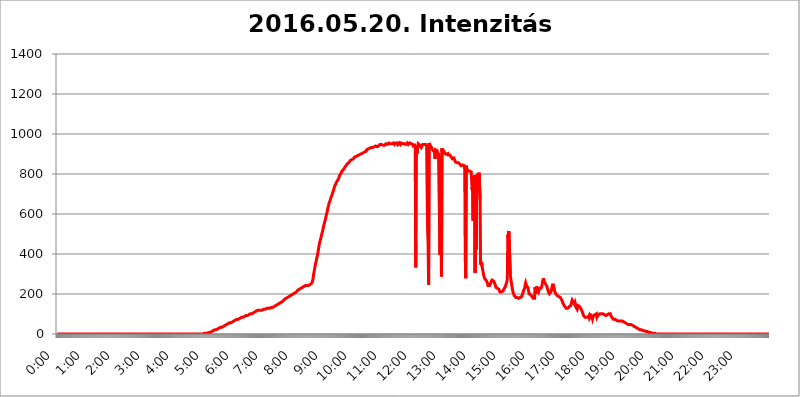
| Category | 2016.05.20. Intenzitás [W/m^2] |
|---|---|
| 0.0 | 0 |
| 0.0006944444444444445 | 0 |
| 0.001388888888888889 | 0 |
| 0.0020833333333333333 | 0 |
| 0.002777777777777778 | 0 |
| 0.003472222222222222 | 0 |
| 0.004166666666666667 | 0 |
| 0.004861111111111111 | 0 |
| 0.005555555555555556 | 0 |
| 0.0062499999999999995 | 0 |
| 0.006944444444444444 | 0 |
| 0.007638888888888889 | 0 |
| 0.008333333333333333 | 0 |
| 0.009027777777777779 | 0 |
| 0.009722222222222222 | 0 |
| 0.010416666666666666 | 0 |
| 0.011111111111111112 | 0 |
| 0.011805555555555555 | 0 |
| 0.012499999999999999 | 0 |
| 0.013194444444444444 | 0 |
| 0.013888888888888888 | 0 |
| 0.014583333333333332 | 0 |
| 0.015277777777777777 | 0 |
| 0.015972222222222224 | 0 |
| 0.016666666666666666 | 0 |
| 0.017361111111111112 | 0 |
| 0.018055555555555557 | 0 |
| 0.01875 | 0 |
| 0.019444444444444445 | 0 |
| 0.02013888888888889 | 0 |
| 0.020833333333333332 | 0 |
| 0.02152777777777778 | 0 |
| 0.022222222222222223 | 0 |
| 0.02291666666666667 | 0 |
| 0.02361111111111111 | 0 |
| 0.024305555555555556 | 0 |
| 0.024999999999999998 | 0 |
| 0.025694444444444447 | 0 |
| 0.02638888888888889 | 0 |
| 0.027083333333333334 | 0 |
| 0.027777777777777776 | 0 |
| 0.02847222222222222 | 0 |
| 0.029166666666666664 | 0 |
| 0.029861111111111113 | 0 |
| 0.030555555555555555 | 0 |
| 0.03125 | 0 |
| 0.03194444444444445 | 0 |
| 0.03263888888888889 | 0 |
| 0.03333333333333333 | 0 |
| 0.034027777777777775 | 0 |
| 0.034722222222222224 | 0 |
| 0.035416666666666666 | 0 |
| 0.036111111111111115 | 0 |
| 0.03680555555555556 | 0 |
| 0.0375 | 0 |
| 0.03819444444444444 | 0 |
| 0.03888888888888889 | 0 |
| 0.03958333333333333 | 0 |
| 0.04027777777777778 | 0 |
| 0.04097222222222222 | 0 |
| 0.041666666666666664 | 0 |
| 0.042361111111111106 | 0 |
| 0.04305555555555556 | 0 |
| 0.043750000000000004 | 0 |
| 0.044444444444444446 | 0 |
| 0.04513888888888889 | 0 |
| 0.04583333333333334 | 0 |
| 0.04652777777777778 | 0 |
| 0.04722222222222222 | 0 |
| 0.04791666666666666 | 0 |
| 0.04861111111111111 | 0 |
| 0.049305555555555554 | 0 |
| 0.049999999999999996 | 0 |
| 0.05069444444444445 | 0 |
| 0.051388888888888894 | 0 |
| 0.052083333333333336 | 0 |
| 0.05277777777777778 | 0 |
| 0.05347222222222222 | 0 |
| 0.05416666666666667 | 0 |
| 0.05486111111111111 | 0 |
| 0.05555555555555555 | 0 |
| 0.05625 | 0 |
| 0.05694444444444444 | 0 |
| 0.057638888888888885 | 0 |
| 0.05833333333333333 | 0 |
| 0.05902777777777778 | 0 |
| 0.059722222222222225 | 0 |
| 0.06041666666666667 | 0 |
| 0.061111111111111116 | 0 |
| 0.06180555555555556 | 0 |
| 0.0625 | 0 |
| 0.06319444444444444 | 0 |
| 0.06388888888888888 | 0 |
| 0.06458333333333334 | 0 |
| 0.06527777777777778 | 0 |
| 0.06597222222222222 | 0 |
| 0.06666666666666667 | 0 |
| 0.06736111111111111 | 0 |
| 0.06805555555555555 | 0 |
| 0.06874999999999999 | 0 |
| 0.06944444444444443 | 0 |
| 0.07013888888888889 | 0 |
| 0.07083333333333333 | 0 |
| 0.07152777777777779 | 0 |
| 0.07222222222222223 | 0 |
| 0.07291666666666667 | 0 |
| 0.07361111111111111 | 0 |
| 0.07430555555555556 | 0 |
| 0.075 | 0 |
| 0.07569444444444444 | 0 |
| 0.0763888888888889 | 0 |
| 0.07708333333333334 | 0 |
| 0.07777777777777778 | 0 |
| 0.07847222222222222 | 0 |
| 0.07916666666666666 | 0 |
| 0.0798611111111111 | 0 |
| 0.08055555555555556 | 0 |
| 0.08125 | 0 |
| 0.08194444444444444 | 0 |
| 0.08263888888888889 | 0 |
| 0.08333333333333333 | 0 |
| 0.08402777777777777 | 0 |
| 0.08472222222222221 | 0 |
| 0.08541666666666665 | 0 |
| 0.08611111111111112 | 0 |
| 0.08680555555555557 | 0 |
| 0.08750000000000001 | 0 |
| 0.08819444444444445 | 0 |
| 0.08888888888888889 | 0 |
| 0.08958333333333333 | 0 |
| 0.09027777777777778 | 0 |
| 0.09097222222222222 | 0 |
| 0.09166666666666667 | 0 |
| 0.09236111111111112 | 0 |
| 0.09305555555555556 | 0 |
| 0.09375 | 0 |
| 0.09444444444444444 | 0 |
| 0.09513888888888888 | 0 |
| 0.09583333333333333 | 0 |
| 0.09652777777777777 | 0 |
| 0.09722222222222222 | 0 |
| 0.09791666666666667 | 0 |
| 0.09861111111111111 | 0 |
| 0.09930555555555555 | 0 |
| 0.09999999999999999 | 0 |
| 0.10069444444444443 | 0 |
| 0.1013888888888889 | 0 |
| 0.10208333333333335 | 0 |
| 0.10277777777777779 | 0 |
| 0.10347222222222223 | 0 |
| 0.10416666666666667 | 0 |
| 0.10486111111111111 | 0 |
| 0.10555555555555556 | 0 |
| 0.10625 | 0 |
| 0.10694444444444444 | 0 |
| 0.1076388888888889 | 0 |
| 0.10833333333333334 | 0 |
| 0.10902777777777778 | 0 |
| 0.10972222222222222 | 0 |
| 0.1111111111111111 | 0 |
| 0.11180555555555556 | 0 |
| 0.11180555555555556 | 0 |
| 0.1125 | 0 |
| 0.11319444444444444 | 0 |
| 0.11388888888888889 | 0 |
| 0.11458333333333333 | 0 |
| 0.11527777777777777 | 0 |
| 0.11597222222222221 | 0 |
| 0.11666666666666665 | 0 |
| 0.1173611111111111 | 0 |
| 0.11805555555555557 | 0 |
| 0.11944444444444445 | 0 |
| 0.12013888888888889 | 0 |
| 0.12083333333333333 | 0 |
| 0.12152777777777778 | 0 |
| 0.12222222222222223 | 0 |
| 0.12291666666666667 | 0 |
| 0.12291666666666667 | 0 |
| 0.12361111111111112 | 0 |
| 0.12430555555555556 | 0 |
| 0.125 | 0 |
| 0.12569444444444444 | 0 |
| 0.12638888888888888 | 0 |
| 0.12708333333333333 | 0 |
| 0.16875 | 0 |
| 0.12847222222222224 | 0 |
| 0.12916666666666668 | 0 |
| 0.12986111111111112 | 0 |
| 0.13055555555555556 | 0 |
| 0.13125 | 0 |
| 0.13194444444444445 | 0 |
| 0.1326388888888889 | 0 |
| 0.13333333333333333 | 0 |
| 0.13402777777777777 | 0 |
| 0.13402777777777777 | 0 |
| 0.13472222222222222 | 0 |
| 0.13541666666666666 | 0 |
| 0.1361111111111111 | 0 |
| 0.13749999999999998 | 0 |
| 0.13819444444444443 | 0 |
| 0.1388888888888889 | 0 |
| 0.13958333333333334 | 0 |
| 0.14027777777777778 | 0 |
| 0.14097222222222222 | 0 |
| 0.14166666666666666 | 0 |
| 0.1423611111111111 | 0 |
| 0.14305555555555557 | 0 |
| 0.14375000000000002 | 0 |
| 0.14444444444444446 | 0 |
| 0.1451388888888889 | 0 |
| 0.1451388888888889 | 0 |
| 0.14652777777777778 | 0 |
| 0.14722222222222223 | 0 |
| 0.14791666666666667 | 0 |
| 0.1486111111111111 | 0 |
| 0.14930555555555555 | 0 |
| 0.15 | 0 |
| 0.15069444444444444 | 0 |
| 0.15138888888888888 | 0 |
| 0.15208333333333332 | 0 |
| 0.15277777777777776 | 0 |
| 0.15347222222222223 | 0 |
| 0.15416666666666667 | 0 |
| 0.15486111111111112 | 0 |
| 0.15555555555555556 | 0 |
| 0.15625 | 0 |
| 0.15694444444444444 | 0 |
| 0.15763888888888888 | 0 |
| 0.15833333333333333 | 0 |
| 0.15902777777777777 | 0 |
| 0.15972222222222224 | 0 |
| 0.16041666666666668 | 0 |
| 0.16111111111111112 | 0 |
| 0.16180555555555556 | 0 |
| 0.1625 | 0 |
| 0.16319444444444445 | 0 |
| 0.1638888888888889 | 0 |
| 0.16458333333333333 | 0 |
| 0.16527777777777777 | 0 |
| 0.16597222222222222 | 0 |
| 0.16666666666666666 | 0 |
| 0.1673611111111111 | 0 |
| 0.16805555555555554 | 0 |
| 0.16874999999999998 | 0 |
| 0.16944444444444443 | 0 |
| 0.17013888888888887 | 0 |
| 0.1708333333333333 | 0 |
| 0.17152777777777775 | 0 |
| 0.17222222222222225 | 0 |
| 0.1729166666666667 | 0 |
| 0.17361111111111113 | 0 |
| 0.17430555555555557 | 0 |
| 0.17500000000000002 | 0 |
| 0.17569444444444446 | 0 |
| 0.1763888888888889 | 0 |
| 0.17708333333333334 | 0 |
| 0.17777777777777778 | 0 |
| 0.17847222222222223 | 0 |
| 0.17916666666666667 | 0 |
| 0.1798611111111111 | 0 |
| 0.18055555555555555 | 0 |
| 0.18125 | 0 |
| 0.18194444444444444 | 0 |
| 0.1826388888888889 | 0 |
| 0.18333333333333335 | 0 |
| 0.1840277777777778 | 0 |
| 0.18472222222222223 | 0 |
| 0.18541666666666667 | 0 |
| 0.18611111111111112 | 0 |
| 0.18680555555555556 | 0 |
| 0.1875 | 0 |
| 0.18819444444444444 | 0 |
| 0.18888888888888888 | 0 |
| 0.18958333333333333 | 0 |
| 0.19027777777777777 | 0 |
| 0.1909722222222222 | 0 |
| 0.19166666666666665 | 0 |
| 0.19236111111111112 | 0 |
| 0.19305555555555554 | 0 |
| 0.19375 | 0 |
| 0.19444444444444445 | 0 |
| 0.1951388888888889 | 0 |
| 0.19583333333333333 | 0 |
| 0.19652777777777777 | 0 |
| 0.19722222222222222 | 0 |
| 0.19791666666666666 | 0 |
| 0.1986111111111111 | 0 |
| 0.19930555555555554 | 0 |
| 0.19999999999999998 | 0 |
| 0.20069444444444443 | 0 |
| 0.20138888888888887 | 0 |
| 0.2020833333333333 | 0 |
| 0.2027777777777778 | 0 |
| 0.2034722222222222 | 0 |
| 0.2041666666666667 | 0 |
| 0.20486111111111113 | 0 |
| 0.20555555555555557 | 3.525 |
| 0.20625000000000002 | 3.525 |
| 0.20694444444444446 | 3.525 |
| 0.2076388888888889 | 3.525 |
| 0.20833333333333334 | 3.525 |
| 0.20902777777777778 | 3.525 |
| 0.20972222222222223 | 3.525 |
| 0.21041666666666667 | 3.525 |
| 0.2111111111111111 | 3.525 |
| 0.21180555555555555 | 3.525 |
| 0.2125 | 7.887 |
| 0.21319444444444444 | 7.887 |
| 0.2138888888888889 | 7.887 |
| 0.21458333333333335 | 7.887 |
| 0.2152777777777778 | 7.887 |
| 0.21597222222222223 | 12.257 |
| 0.21666666666666667 | 12.257 |
| 0.21736111111111112 | 12.257 |
| 0.21805555555555556 | 12.257 |
| 0.21875 | 16.636 |
| 0.21944444444444444 | 16.636 |
| 0.22013888888888888 | 16.636 |
| 0.22083333333333333 | 21.024 |
| 0.22152777777777777 | 21.024 |
| 0.2222222222222222 | 21.024 |
| 0.22291666666666665 | 21.024 |
| 0.2236111111111111 | 21.024 |
| 0.22430555555555556 | 25.419 |
| 0.225 | 25.419 |
| 0.22569444444444445 | 25.419 |
| 0.2263888888888889 | 29.823 |
| 0.22708333333333333 | 29.823 |
| 0.22777777777777777 | 29.823 |
| 0.22847222222222222 | 29.823 |
| 0.22916666666666666 | 34.234 |
| 0.2298611111111111 | 34.234 |
| 0.23055555555555554 | 34.234 |
| 0.23124999999999998 | 34.234 |
| 0.23194444444444443 | 38.653 |
| 0.23263888888888887 | 38.653 |
| 0.2333333333333333 | 38.653 |
| 0.2340277777777778 | 38.653 |
| 0.2347222222222222 | 43.079 |
| 0.2354166666666667 | 43.079 |
| 0.23611111111111113 | 43.079 |
| 0.23680555555555557 | 47.511 |
| 0.23750000000000002 | 47.511 |
| 0.23819444444444446 | 47.511 |
| 0.2388888888888889 | 47.511 |
| 0.23958333333333334 | 51.951 |
| 0.24027777777777778 | 51.951 |
| 0.24097222222222223 | 51.951 |
| 0.24166666666666667 | 56.398 |
| 0.2423611111111111 | 56.398 |
| 0.24305555555555555 | 56.398 |
| 0.24375 | 56.398 |
| 0.24444444444444446 | 60.85 |
| 0.24513888888888888 | 60.85 |
| 0.24583333333333335 | 60.85 |
| 0.2465277777777778 | 65.31 |
| 0.24722222222222223 | 65.31 |
| 0.24791666666666667 | 65.31 |
| 0.24861111111111112 | 65.31 |
| 0.24930555555555556 | 65.31 |
| 0.25 | 69.775 |
| 0.25069444444444444 | 69.775 |
| 0.2513888888888889 | 74.246 |
| 0.2520833333333333 | 74.246 |
| 0.25277777777777777 | 74.246 |
| 0.2534722222222222 | 74.246 |
| 0.25416666666666665 | 74.246 |
| 0.2548611111111111 | 78.722 |
| 0.2555555555555556 | 78.722 |
| 0.25625000000000003 | 78.722 |
| 0.2569444444444445 | 78.722 |
| 0.2576388888888889 | 83.205 |
| 0.25833333333333336 | 83.205 |
| 0.2590277777777778 | 83.205 |
| 0.25972222222222224 | 83.205 |
| 0.2604166666666667 | 83.205 |
| 0.2611111111111111 | 83.205 |
| 0.26180555555555557 | 87.692 |
| 0.2625 | 87.692 |
| 0.26319444444444445 | 87.692 |
| 0.2638888888888889 | 92.184 |
| 0.26458333333333334 | 92.184 |
| 0.2652777777777778 | 92.184 |
| 0.2659722222222222 | 92.184 |
| 0.26666666666666666 | 92.184 |
| 0.2673611111111111 | 96.682 |
| 0.26805555555555555 | 96.682 |
| 0.26875 | 96.682 |
| 0.26944444444444443 | 96.682 |
| 0.2701388888888889 | 101.184 |
| 0.2708333333333333 | 101.184 |
| 0.27152777777777776 | 101.184 |
| 0.2722222222222222 | 101.184 |
| 0.27291666666666664 | 101.184 |
| 0.2736111111111111 | 101.184 |
| 0.2743055555555555 | 105.69 |
| 0.27499999999999997 | 105.69 |
| 0.27569444444444446 | 105.69 |
| 0.27638888888888885 | 110.201 |
| 0.27708333333333335 | 110.201 |
| 0.2777777777777778 | 110.201 |
| 0.27847222222222223 | 110.201 |
| 0.2791666666666667 | 114.716 |
| 0.2798611111111111 | 114.716 |
| 0.28055555555555556 | 119.235 |
| 0.28125 | 119.235 |
| 0.28194444444444444 | 119.235 |
| 0.2826388888888889 | 119.235 |
| 0.2833333333333333 | 119.235 |
| 0.28402777777777777 | 119.235 |
| 0.2847222222222222 | 119.235 |
| 0.28541666666666665 | 119.235 |
| 0.28611111111111115 | 119.235 |
| 0.28680555555555554 | 119.235 |
| 0.28750000000000003 | 119.235 |
| 0.2881944444444445 | 119.235 |
| 0.2888888888888889 | 123.758 |
| 0.28958333333333336 | 123.758 |
| 0.2902777777777778 | 123.758 |
| 0.29097222222222224 | 123.758 |
| 0.2916666666666667 | 123.758 |
| 0.2923611111111111 | 123.758 |
| 0.29305555555555557 | 123.758 |
| 0.29375 | 128.284 |
| 0.29444444444444445 | 128.284 |
| 0.2951388888888889 | 128.284 |
| 0.29583333333333334 | 128.284 |
| 0.2965277777777778 | 128.284 |
| 0.2972222222222222 | 128.284 |
| 0.29791666666666666 | 128.284 |
| 0.2986111111111111 | 128.284 |
| 0.29930555555555555 | 132.814 |
| 0.3 | 132.814 |
| 0.30069444444444443 | 132.814 |
| 0.3013888888888889 | 132.814 |
| 0.3020833333333333 | 132.814 |
| 0.30277777777777776 | 137.347 |
| 0.3034722222222222 | 137.347 |
| 0.30416666666666664 | 137.347 |
| 0.3048611111111111 | 137.347 |
| 0.3055555555555555 | 141.884 |
| 0.30624999999999997 | 141.884 |
| 0.3069444444444444 | 146.423 |
| 0.3076388888888889 | 146.423 |
| 0.30833333333333335 | 146.423 |
| 0.3090277777777778 | 150.964 |
| 0.30972222222222223 | 150.964 |
| 0.3104166666666667 | 150.964 |
| 0.3111111111111111 | 155.509 |
| 0.31180555555555556 | 155.509 |
| 0.3125 | 155.509 |
| 0.31319444444444444 | 155.509 |
| 0.3138888888888889 | 160.056 |
| 0.3145833333333333 | 160.056 |
| 0.31527777777777777 | 164.605 |
| 0.3159722222222222 | 164.605 |
| 0.31666666666666665 | 164.605 |
| 0.31736111111111115 | 169.156 |
| 0.31805555555555554 | 169.156 |
| 0.31875000000000003 | 173.709 |
| 0.3194444444444445 | 173.709 |
| 0.3201388888888889 | 173.709 |
| 0.32083333333333336 | 178.264 |
| 0.3215277777777778 | 178.264 |
| 0.32222222222222224 | 182.82 |
| 0.3229166666666667 | 182.82 |
| 0.3236111111111111 | 182.82 |
| 0.32430555555555557 | 182.82 |
| 0.325 | 187.378 |
| 0.32569444444444445 | 187.378 |
| 0.3263888888888889 | 187.378 |
| 0.32708333333333334 | 191.937 |
| 0.3277777777777778 | 191.937 |
| 0.3284722222222222 | 191.937 |
| 0.32916666666666666 | 196.497 |
| 0.3298611111111111 | 196.497 |
| 0.33055555555555555 | 201.058 |
| 0.33125 | 201.058 |
| 0.33194444444444443 | 201.058 |
| 0.3326388888888889 | 205.62 |
| 0.3333333333333333 | 205.62 |
| 0.3340277777777778 | 210.182 |
| 0.3347222222222222 | 210.182 |
| 0.3354166666666667 | 210.182 |
| 0.3361111111111111 | 214.746 |
| 0.3368055555555556 | 214.746 |
| 0.33749999999999997 | 219.309 |
| 0.33819444444444446 | 219.309 |
| 0.33888888888888885 | 219.309 |
| 0.33958333333333335 | 223.873 |
| 0.34027777777777773 | 228.436 |
| 0.34097222222222223 | 228.436 |
| 0.3416666666666666 | 228.436 |
| 0.3423611111111111 | 228.436 |
| 0.3430555555555555 | 228.436 |
| 0.34375 | 233 |
| 0.3444444444444445 | 233 |
| 0.3451388888888889 | 237.564 |
| 0.3458333333333334 | 237.564 |
| 0.34652777777777777 | 237.564 |
| 0.34722222222222227 | 237.564 |
| 0.34791666666666665 | 242.127 |
| 0.34861111111111115 | 242.127 |
| 0.34930555555555554 | 242.127 |
| 0.35000000000000003 | 242.127 |
| 0.3506944444444444 | 242.127 |
| 0.3513888888888889 | 242.127 |
| 0.3520833333333333 | 242.127 |
| 0.3527777777777778 | 242.127 |
| 0.3534722222222222 | 242.127 |
| 0.3541666666666667 | 246.689 |
| 0.3548611111111111 | 251.251 |
| 0.35555555555555557 | 251.251 |
| 0.35625 | 251.251 |
| 0.35694444444444445 | 255.813 |
| 0.3576388888888889 | 260.373 |
| 0.35833333333333334 | 269.49 |
| 0.3590277777777778 | 283.156 |
| 0.3597222222222222 | 301.354 |
| 0.36041666666666666 | 314.98 |
| 0.3611111111111111 | 328.584 |
| 0.36180555555555555 | 342.162 |
| 0.3625 | 355.712 |
| 0.36319444444444443 | 364.728 |
| 0.3638888888888889 | 378.224 |
| 0.3645833333333333 | 387.202 |
| 0.3652777777777778 | 400.638 |
| 0.3659722222222222 | 414.035 |
| 0.3666666666666667 | 431.833 |
| 0.3673611111111111 | 445.129 |
| 0.3680555555555556 | 458.38 |
| 0.36874999999999997 | 462.786 |
| 0.36944444444444446 | 475.972 |
| 0.37013888888888885 | 484.735 |
| 0.37083333333333335 | 497.836 |
| 0.37152777777777773 | 506.542 |
| 0.37222222222222223 | 515.223 |
| 0.3729166666666666 | 528.2 |
| 0.3736111111111111 | 532.513 |
| 0.3743055555555555 | 549.704 |
| 0.375 | 558.261 |
| 0.3756944444444445 | 566.793 |
| 0.3763888888888889 | 579.542 |
| 0.3770833333333334 | 588.009 |
| 0.37777777777777777 | 600.661 |
| 0.37847222222222227 | 609.062 |
| 0.37916666666666665 | 621.613 |
| 0.37986111111111115 | 634.105 |
| 0.38055555555555554 | 642.4 |
| 0.38125000000000003 | 654.791 |
| 0.3819444444444444 | 658.909 |
| 0.3826388888888889 | 667.123 |
| 0.3833333333333333 | 671.22 |
| 0.3840277777777778 | 683.473 |
| 0.3847222222222222 | 687.544 |
| 0.3854166666666667 | 695.666 |
| 0.3861111111111111 | 703.762 |
| 0.38680555555555557 | 711.832 |
| 0.3875 | 719.877 |
| 0.38819444444444445 | 727.896 |
| 0.3888888888888889 | 731.896 |
| 0.38958333333333334 | 743.859 |
| 0.3902777777777778 | 747.834 |
| 0.3909722222222222 | 751.803 |
| 0.39166666666666666 | 759.723 |
| 0.3923611111111111 | 759.723 |
| 0.39305555555555555 | 767.62 |
| 0.39375 | 771.559 |
| 0.39444444444444443 | 775.492 |
| 0.3951388888888889 | 783.342 |
| 0.3958333333333333 | 791.169 |
| 0.3965277777777778 | 795.074 |
| 0.3972222222222222 | 798.974 |
| 0.3979166666666667 | 802.868 |
| 0.3986111111111111 | 806.757 |
| 0.3993055555555556 | 814.519 |
| 0.39999999999999997 | 814.519 |
| 0.40069444444444446 | 818.392 |
| 0.40138888888888885 | 822.26 |
| 0.40208333333333335 | 826.123 |
| 0.40277777777777773 | 829.981 |
| 0.40347222222222223 | 833.834 |
| 0.4041666666666666 | 837.682 |
| 0.4048611111111111 | 841.526 |
| 0.4055555555555555 | 845.365 |
| 0.40625 | 845.365 |
| 0.4069444444444445 | 849.199 |
| 0.4076388888888889 | 853.029 |
| 0.4083333333333334 | 853.029 |
| 0.40902777777777777 | 856.855 |
| 0.40972222222222227 | 860.676 |
| 0.41041666666666665 | 864.493 |
| 0.41111111111111115 | 868.305 |
| 0.41180555555555554 | 868.305 |
| 0.41250000000000003 | 868.305 |
| 0.4131944444444444 | 872.114 |
| 0.4138888888888889 | 875.918 |
| 0.4145833333333333 | 875.918 |
| 0.4152777777777778 | 875.918 |
| 0.4159722222222222 | 879.719 |
| 0.4166666666666667 | 883.516 |
| 0.4173611111111111 | 883.516 |
| 0.41805555555555557 | 887.309 |
| 0.41875 | 887.309 |
| 0.41944444444444445 | 887.309 |
| 0.4201388888888889 | 891.099 |
| 0.42083333333333334 | 891.099 |
| 0.4215277777777778 | 891.099 |
| 0.4222222222222222 | 894.885 |
| 0.42291666666666666 | 894.885 |
| 0.4236111111111111 | 894.885 |
| 0.42430555555555555 | 894.885 |
| 0.425 | 898.668 |
| 0.42569444444444443 | 898.668 |
| 0.4263888888888889 | 902.447 |
| 0.4270833333333333 | 902.447 |
| 0.4277777777777778 | 902.447 |
| 0.4284722222222222 | 906.223 |
| 0.4291666666666667 | 906.223 |
| 0.4298611111111111 | 906.223 |
| 0.4305555555555556 | 906.223 |
| 0.43124999999999997 | 909.996 |
| 0.43194444444444446 | 909.996 |
| 0.43263888888888885 | 909.996 |
| 0.43333333333333335 | 913.766 |
| 0.43402777777777773 | 921.298 |
| 0.43472222222222223 | 917.534 |
| 0.4354166666666666 | 921.298 |
| 0.4361111111111111 | 925.06 |
| 0.4368055555555555 | 928.819 |
| 0.4375 | 928.819 |
| 0.4381944444444445 | 928.819 |
| 0.4388888888888889 | 932.576 |
| 0.4395833333333334 | 932.576 |
| 0.44027777777777777 | 932.576 |
| 0.44097222222222227 | 932.576 |
| 0.44166666666666665 | 932.576 |
| 0.44236111111111115 | 932.576 |
| 0.44305555555555554 | 932.576 |
| 0.44375000000000003 | 936.33 |
| 0.4444444444444444 | 936.33 |
| 0.4451388888888889 | 936.33 |
| 0.4458333333333333 | 936.33 |
| 0.4465277777777778 | 940.082 |
| 0.4472222222222222 | 940.082 |
| 0.4479166666666667 | 936.33 |
| 0.4486111111111111 | 936.33 |
| 0.44930555555555557 | 936.33 |
| 0.45 | 940.082 |
| 0.45069444444444445 | 940.082 |
| 0.4513888888888889 | 943.832 |
| 0.45208333333333334 | 943.832 |
| 0.4527777777777778 | 947.58 |
| 0.4534722222222222 | 947.58 |
| 0.45416666666666666 | 947.58 |
| 0.4548611111111111 | 947.58 |
| 0.45555555555555555 | 943.832 |
| 0.45625 | 943.832 |
| 0.45694444444444443 | 943.832 |
| 0.4576388888888889 | 943.832 |
| 0.4583333333333333 | 940.082 |
| 0.4590277777777778 | 943.832 |
| 0.4597222222222222 | 943.832 |
| 0.4604166666666667 | 943.832 |
| 0.4611111111111111 | 951.327 |
| 0.4618055555555556 | 951.327 |
| 0.46249999999999997 | 947.58 |
| 0.46319444444444446 | 947.58 |
| 0.46388888888888885 | 951.327 |
| 0.46458333333333335 | 951.327 |
| 0.46527777777777773 | 955.071 |
| 0.46597222222222223 | 951.327 |
| 0.4666666666666666 | 951.327 |
| 0.4673611111111111 | 951.327 |
| 0.4680555555555555 | 947.58 |
| 0.46875 | 947.58 |
| 0.4694444444444445 | 951.327 |
| 0.4701388888888889 | 951.327 |
| 0.4708333333333334 | 955.071 |
| 0.47152777777777777 | 955.071 |
| 0.47222222222222227 | 955.071 |
| 0.47291666666666665 | 947.58 |
| 0.47361111111111115 | 951.327 |
| 0.47430555555555554 | 943.832 |
| 0.47500000000000003 | 955.071 |
| 0.4756944444444444 | 951.327 |
| 0.4763888888888889 | 951.327 |
| 0.4770833333333333 | 955.071 |
| 0.4777777777777778 | 947.58 |
| 0.4784722222222222 | 951.327 |
| 0.4791666666666667 | 951.327 |
| 0.4798611111111111 | 955.071 |
| 0.48055555555555557 | 951.327 |
| 0.48125 | 947.58 |
| 0.48194444444444445 | 947.58 |
| 0.4826388888888889 | 955.071 |
| 0.48333333333333334 | 958.814 |
| 0.4840277777777778 | 955.071 |
| 0.4847222222222222 | 951.327 |
| 0.48541666666666666 | 951.327 |
| 0.4861111111111111 | 951.327 |
| 0.48680555555555555 | 951.327 |
| 0.4875 | 947.58 |
| 0.48819444444444443 | 947.58 |
| 0.4888888888888889 | 947.58 |
| 0.4895833333333333 | 947.58 |
| 0.4902777777777778 | 947.58 |
| 0.4909722222222222 | 955.071 |
| 0.4916666666666667 | 951.327 |
| 0.4923611111111111 | 947.58 |
| 0.4930555555555556 | 951.327 |
| 0.49374999999999997 | 951.327 |
| 0.49444444444444446 | 955.071 |
| 0.49513888888888885 | 955.071 |
| 0.49583333333333335 | 955.071 |
| 0.49652777777777773 | 951.327 |
| 0.49722222222222223 | 951.327 |
| 0.4979166666666666 | 955.071 |
| 0.4986111111111111 | 947.58 |
| 0.4993055555555555 | 940.082 |
| 0.5 | 940.082 |
| 0.5006944444444444 | 940.082 |
| 0.5013888888888889 | 943.832 |
| 0.5020833333333333 | 936.33 |
| 0.5027777777777778 | 333.113 |
| 0.5034722222222222 | 940.082 |
| 0.5041666666666667 | 936.33 |
| 0.5048611111111111 | 902.447 |
| 0.5055555555555555 | 940.082 |
| 0.50625 | 951.327 |
| 0.5069444444444444 | 947.58 |
| 0.5076388888888889 | 951.327 |
| 0.5083333333333333 | 943.832 |
| 0.5090277777777777 | 943.832 |
| 0.5097222222222222 | 940.082 |
| 0.5104166666666666 | 932.576 |
| 0.5111111111111112 | 932.576 |
| 0.5118055555555555 | 936.33 |
| 0.5125000000000001 | 947.58 |
| 0.5131944444444444 | 947.58 |
| 0.513888888888889 | 943.832 |
| 0.5145833333333333 | 947.58 |
| 0.5152777777777778 | 947.58 |
| 0.5159722222222222 | 947.58 |
| 0.5166666666666667 | 947.58 |
| 0.517361111111111 | 943.832 |
| 0.5180555555555556 | 940.082 |
| 0.5187499999999999 | 936.33 |
| 0.5194444444444445 | 519.555 |
| 0.5201388888888888 | 453.968 |
| 0.5208333333333334 | 246.689 |
| 0.5215277777777778 | 955.071 |
| 0.5222222222222223 | 947.58 |
| 0.5229166666666667 | 943.832 |
| 0.5236111111111111 | 947.58 |
| 0.5243055555555556 | 936.33 |
| 0.525 | 940.082 |
| 0.5256944444444445 | 925.06 |
| 0.5263888888888889 | 925.06 |
| 0.5270833333333333 | 917.534 |
| 0.5277777777777778 | 921.298 |
| 0.5284722222222222 | 917.534 |
| 0.5291666666666667 | 909.996 |
| 0.5298611111111111 | 875.918 |
| 0.5305555555555556 | 921.298 |
| 0.53125 | 917.534 |
| 0.5319444444444444 | 917.534 |
| 0.5326388888888889 | 917.534 |
| 0.5333333333333333 | 921.298 |
| 0.5340277777777778 | 917.534 |
| 0.5347222222222222 | 898.668 |
| 0.5354166666666667 | 902.447 |
| 0.5361111111111111 | 902.447 |
| 0.5368055555555555 | 396.164 |
| 0.5375 | 891.099 |
| 0.5381944444444444 | 545.416 |
| 0.5388888888888889 | 287.709 |
| 0.5395833333333333 | 928.819 |
| 0.5402777777777777 | 909.996 |
| 0.5409722222222222 | 906.223 |
| 0.5416666666666666 | 913.766 |
| 0.5423611111111112 | 913.766 |
| 0.5430555555555555 | 909.996 |
| 0.5437500000000001 | 902.447 |
| 0.5444444444444444 | 902.447 |
| 0.545138888888889 | 898.668 |
| 0.5458333333333333 | 898.668 |
| 0.5465277777777778 | 894.885 |
| 0.5472222222222222 | 902.447 |
| 0.5479166666666667 | 902.447 |
| 0.548611111111111 | 894.885 |
| 0.5493055555555556 | 898.668 |
| 0.5499999999999999 | 894.885 |
| 0.5506944444444445 | 894.885 |
| 0.5513888888888888 | 891.099 |
| 0.5520833333333334 | 887.309 |
| 0.5527777777777778 | 887.309 |
| 0.5534722222222223 | 883.516 |
| 0.5541666666666667 | 875.918 |
| 0.5548611111111111 | 875.918 |
| 0.5555555555555556 | 879.719 |
| 0.55625 | 879.719 |
| 0.5569444444444445 | 875.918 |
| 0.5576388888888889 | 868.305 |
| 0.5583333333333333 | 860.676 |
| 0.5590277777777778 | 864.493 |
| 0.5597222222222222 | 860.676 |
| 0.5604166666666667 | 856.855 |
| 0.5611111111111111 | 853.029 |
| 0.5618055555555556 | 856.855 |
| 0.5625 | 856.855 |
| 0.5631944444444444 | 856.855 |
| 0.5638888888888889 | 853.029 |
| 0.5645833333333333 | 849.199 |
| 0.5652777777777778 | 845.365 |
| 0.5659722222222222 | 845.365 |
| 0.5666666666666667 | 841.526 |
| 0.5673611111111111 | 837.682 |
| 0.5680555555555555 | 841.526 |
| 0.56875 | 845.365 |
| 0.5694444444444444 | 845.365 |
| 0.5701388888888889 | 841.526 |
| 0.5708333333333333 | 841.526 |
| 0.5715277777777777 | 822.26 |
| 0.5722222222222222 | 391.685 |
| 0.5729166666666666 | 278.603 |
| 0.5736111111111112 | 841.526 |
| 0.5743055555555555 | 829.981 |
| 0.5750000000000001 | 822.26 |
| 0.5756944444444444 | 822.26 |
| 0.576388888888889 | 814.519 |
| 0.5770833333333333 | 818.392 |
| 0.5777777777777778 | 818.392 |
| 0.5784722222222222 | 814.519 |
| 0.5791666666666667 | 814.519 |
| 0.579861111111111 | 814.519 |
| 0.5805555555555556 | 810.641 |
| 0.5812499999999999 | 806.757 |
| 0.5819444444444445 | 719.877 |
| 0.5826388888888888 | 751.803 |
| 0.5833333333333334 | 566.793 |
| 0.5840277777777778 | 791.169 |
| 0.5847222222222223 | 763.674 |
| 0.5854166666666667 | 791.169 |
| 0.5861111111111111 | 305.898 |
| 0.5868055555555556 | 795.074 |
| 0.5875 | 422.943 |
| 0.5881944444444445 | 783.342 |
| 0.5888888888888889 | 795.074 |
| 0.5895833333333333 | 791.169 |
| 0.5902777777777778 | 791.169 |
| 0.5909722222222222 | 795.074 |
| 0.5916666666666667 | 806.757 |
| 0.5923611111111111 | 802.868 |
| 0.5930555555555556 | 671.22 |
| 0.59375 | 346.682 |
| 0.5944444444444444 | 342.162 |
| 0.5951388888888889 | 360.221 |
| 0.5958333333333333 | 337.639 |
| 0.5965277777777778 | 324.052 |
| 0.5972222222222222 | 310.44 |
| 0.5979166666666667 | 296.808 |
| 0.5986111111111111 | 287.709 |
| 0.5993055555555555 | 278.603 |
| 0.6 | 278.603 |
| 0.6006944444444444 | 274.047 |
| 0.6013888888888889 | 269.49 |
| 0.6020833333333333 | 264.932 |
| 0.6027777777777777 | 260.373 |
| 0.6034722222222222 | 251.251 |
| 0.6041666666666666 | 242.127 |
| 0.6048611111111112 | 242.127 |
| 0.6055555555555555 | 242.127 |
| 0.6062500000000001 | 242.127 |
| 0.6069444444444444 | 246.689 |
| 0.607638888888889 | 251.251 |
| 0.6083333333333333 | 260.373 |
| 0.6090277777777778 | 264.932 |
| 0.6097222222222222 | 269.49 |
| 0.6104166666666667 | 264.932 |
| 0.611111111111111 | 264.932 |
| 0.6118055555555556 | 264.932 |
| 0.6124999999999999 | 260.373 |
| 0.6131944444444445 | 255.813 |
| 0.6138888888888888 | 251.251 |
| 0.6145833333333334 | 242.127 |
| 0.6152777777777778 | 233 |
| 0.6159722222222223 | 233 |
| 0.6166666666666667 | 228.436 |
| 0.6173611111111111 | 228.436 |
| 0.6180555555555556 | 228.436 |
| 0.61875 | 223.873 |
| 0.6194444444444445 | 223.873 |
| 0.6201388888888889 | 219.309 |
| 0.6208333333333333 | 210.182 |
| 0.6215277777777778 | 210.182 |
| 0.6222222222222222 | 210.182 |
| 0.6229166666666667 | 210.182 |
| 0.6236111111111111 | 210.182 |
| 0.6243055555555556 | 210.182 |
| 0.625 | 214.746 |
| 0.6256944444444444 | 214.746 |
| 0.6263888888888889 | 219.309 |
| 0.6270833333333333 | 228.436 |
| 0.6277777777777778 | 233 |
| 0.6284722222222222 | 237.564 |
| 0.6291666666666667 | 237.564 |
| 0.6298611111111111 | 242.127 |
| 0.6305555555555555 | 260.373 |
| 0.63125 | 274.047 |
| 0.6319444444444444 | 497.836 |
| 0.6326388888888889 | 484.735 |
| 0.6333333333333333 | 515.223 |
| 0.6340277777777777 | 510.885 |
| 0.6347222222222222 | 510.885 |
| 0.6354166666666666 | 296.808 |
| 0.6361111111111112 | 274.047 |
| 0.6368055555555555 | 260.373 |
| 0.6375000000000001 | 242.127 |
| 0.6381944444444444 | 228.436 |
| 0.638888888888889 | 214.746 |
| 0.6395833333333333 | 205.62 |
| 0.6402777777777778 | 201.058 |
| 0.6409722222222222 | 191.937 |
| 0.6416666666666667 | 191.937 |
| 0.642361111111111 | 187.378 |
| 0.6430555555555556 | 182.82 |
| 0.6437499999999999 | 182.82 |
| 0.6444444444444445 | 182.82 |
| 0.6451388888888888 | 182.82 |
| 0.6458333333333334 | 182.82 |
| 0.6465277777777778 | 178.264 |
| 0.6472222222222223 | 178.264 |
| 0.6479166666666667 | 178.264 |
| 0.6486111111111111 | 182.82 |
| 0.6493055555555556 | 182.82 |
| 0.65 | 182.82 |
| 0.6506944444444445 | 182.82 |
| 0.6513888888888889 | 187.378 |
| 0.6520833333333333 | 191.937 |
| 0.6527777777777778 | 201.058 |
| 0.6534722222222222 | 210.182 |
| 0.6541666666666667 | 219.309 |
| 0.6548611111111111 | 219.309 |
| 0.6555555555555556 | 228.436 |
| 0.65625 | 246.689 |
| 0.6569444444444444 | 255.813 |
| 0.6576388888888889 | 246.689 |
| 0.6583333333333333 | 242.127 |
| 0.6590277777777778 | 237.564 |
| 0.6597222222222222 | 233 |
| 0.6604166666666667 | 228.436 |
| 0.6611111111111111 | 214.746 |
| 0.6618055555555555 | 201.058 |
| 0.6625 | 196.497 |
| 0.6631944444444444 | 196.497 |
| 0.6638888888888889 | 196.497 |
| 0.6645833333333333 | 196.497 |
| 0.6652777777777777 | 191.937 |
| 0.6659722222222222 | 187.378 |
| 0.6666666666666666 | 182.82 |
| 0.6673611111111111 | 178.264 |
| 0.6680555555555556 | 173.709 |
| 0.6687500000000001 | 173.709 |
| 0.6694444444444444 | 178.264 |
| 0.6701388888888888 | 233 |
| 0.6708333333333334 | 237.564 |
| 0.6715277777777778 | 201.058 |
| 0.6722222222222222 | 237.564 |
| 0.6729166666666666 | 228.436 |
| 0.6736111111111112 | 219.309 |
| 0.6743055555555556 | 219.309 |
| 0.6749999999999999 | 210.182 |
| 0.6756944444444444 | 219.309 |
| 0.6763888888888889 | 228.436 |
| 0.6770833333333334 | 228.436 |
| 0.6777777777777777 | 228.436 |
| 0.6784722222222223 | 228.436 |
| 0.6791666666666667 | 233 |
| 0.6798611111111111 | 242.127 |
| 0.6805555555555555 | 260.373 |
| 0.68125 | 260.373 |
| 0.6819444444444445 | 278.603 |
| 0.6826388888888889 | 264.932 |
| 0.6833333333333332 | 264.932 |
| 0.6840277777777778 | 260.373 |
| 0.6847222222222222 | 251.251 |
| 0.6854166666666667 | 251.251 |
| 0.686111111111111 | 246.689 |
| 0.6868055555555556 | 237.564 |
| 0.6875 | 228.436 |
| 0.6881944444444444 | 219.309 |
| 0.688888888888889 | 210.182 |
| 0.6895833333333333 | 205.62 |
| 0.6902777777777778 | 201.058 |
| 0.6909722222222222 | 201.058 |
| 0.6916666666666668 | 201.058 |
| 0.6923611111111111 | 210.182 |
| 0.6930555555555555 | 219.309 |
| 0.69375 | 223.873 |
| 0.6944444444444445 | 242.127 |
| 0.6951388888888889 | 251.251 |
| 0.6958333333333333 | 246.689 |
| 0.6965277777777777 | 255.813 |
| 0.6972222222222223 | 219.309 |
| 0.6979166666666666 | 210.182 |
| 0.6986111111111111 | 205.62 |
| 0.6993055555555556 | 201.058 |
| 0.7000000000000001 | 201.058 |
| 0.7006944444444444 | 196.497 |
| 0.7013888888888888 | 191.937 |
| 0.7020833333333334 | 191.937 |
| 0.7027777777777778 | 191.937 |
| 0.7034722222222222 | 187.378 |
| 0.7041666666666666 | 187.378 |
| 0.7048611111111112 | 187.378 |
| 0.7055555555555556 | 182.82 |
| 0.7062499999999999 | 178.264 |
| 0.7069444444444444 | 173.709 |
| 0.7076388888888889 | 169.156 |
| 0.7083333333333334 | 164.605 |
| 0.7090277777777777 | 155.509 |
| 0.7097222222222223 | 155.509 |
| 0.7104166666666667 | 146.423 |
| 0.7111111111111111 | 141.884 |
| 0.7118055555555555 | 137.347 |
| 0.7125 | 137.347 |
| 0.7131944444444445 | 132.814 |
| 0.7138888888888889 | 128.284 |
| 0.7145833333333332 | 128.284 |
| 0.7152777777777778 | 128.284 |
| 0.7159722222222222 | 128.284 |
| 0.7166666666666667 | 128.284 |
| 0.717361111111111 | 132.814 |
| 0.7180555555555556 | 137.347 |
| 0.71875 | 137.347 |
| 0.7194444444444444 | 137.347 |
| 0.720138888888889 | 141.884 |
| 0.7208333333333333 | 141.884 |
| 0.7215277777777778 | 146.423 |
| 0.7222222222222222 | 169.156 |
| 0.7229166666666668 | 169.156 |
| 0.7236111111111111 | 169.156 |
| 0.7243055555555555 | 155.509 |
| 0.725 | 160.056 |
| 0.7256944444444445 | 146.423 |
| 0.7263888888888889 | 155.509 |
| 0.7270833333333333 | 146.423 |
| 0.7277777777777777 | 132.814 |
| 0.7284722222222223 | 137.347 |
| 0.7291666666666666 | 123.758 |
| 0.7298611111111111 | 132.814 |
| 0.7305555555555556 | 141.884 |
| 0.7312500000000001 | 137.347 |
| 0.7319444444444444 | 137.347 |
| 0.7326388888888888 | 137.347 |
| 0.7333333333333334 | 132.814 |
| 0.7340277777777778 | 128.284 |
| 0.7347222222222222 | 128.284 |
| 0.7354166666666666 | 123.758 |
| 0.7361111111111112 | 114.716 |
| 0.7368055555555556 | 119.235 |
| 0.7374999999999999 | 114.716 |
| 0.7381944444444444 | 92.184 |
| 0.7388888888888889 | 92.184 |
| 0.7395833333333334 | 87.692 |
| 0.7402777777777777 | 83.205 |
| 0.7409722222222223 | 83.205 |
| 0.7416666666666667 | 83.205 |
| 0.7423611111111111 | 83.205 |
| 0.7430555555555555 | 83.205 |
| 0.74375 | 83.205 |
| 0.7444444444444445 | 83.205 |
| 0.7451388888888889 | 83.205 |
| 0.7458333333333332 | 92.184 |
| 0.7465277777777778 | 78.722 |
| 0.7472222222222222 | 74.246 |
| 0.7479166666666667 | 74.246 |
| 0.748611111111111 | 92.184 |
| 0.7493055555555556 | 92.184 |
| 0.75 | 83.205 |
| 0.7506944444444444 | 74.246 |
| 0.751388888888889 | 78.722 |
| 0.7520833333333333 | 92.184 |
| 0.7527777777777778 | 92.184 |
| 0.7534722222222222 | 96.682 |
| 0.7541666666666668 | 96.682 |
| 0.7548611111111111 | 96.682 |
| 0.7555555555555555 | 96.682 |
| 0.75625 | 101.184 |
| 0.7569444444444445 | 83.205 |
| 0.7576388888888889 | 83.205 |
| 0.7583333333333333 | 83.205 |
| 0.7590277777777777 | 96.682 |
| 0.7597222222222223 | 101.184 |
| 0.7604166666666666 | 101.184 |
| 0.7611111111111111 | 101.184 |
| 0.7618055555555556 | 101.184 |
| 0.7625000000000001 | 101.184 |
| 0.7631944444444444 | 101.184 |
| 0.7638888888888888 | 101.184 |
| 0.7645833333333334 | 101.184 |
| 0.7652777777777778 | 101.184 |
| 0.7659722222222222 | 101.184 |
| 0.7666666666666666 | 96.682 |
| 0.7673611111111112 | 96.682 |
| 0.7680555555555556 | 92.184 |
| 0.7687499999999999 | 92.184 |
| 0.7694444444444444 | 92.184 |
| 0.7701388888888889 | 92.184 |
| 0.7708333333333334 | 96.682 |
| 0.7715277777777777 | 96.682 |
| 0.7722222222222223 | 101.184 |
| 0.7729166666666667 | 101.184 |
| 0.7736111111111111 | 101.184 |
| 0.7743055555555555 | 101.184 |
| 0.775 | 101.184 |
| 0.7756944444444445 | 101.184 |
| 0.7763888888888889 | 92.184 |
| 0.7770833333333332 | 87.692 |
| 0.7777777777777778 | 83.205 |
| 0.7784722222222222 | 83.205 |
| 0.7791666666666667 | 78.722 |
| 0.779861111111111 | 74.246 |
| 0.7805555555555556 | 74.246 |
| 0.78125 | 74.246 |
| 0.7819444444444444 | 74.246 |
| 0.782638888888889 | 69.775 |
| 0.7833333333333333 | 69.775 |
| 0.7840277777777778 | 69.775 |
| 0.7847222222222222 | 65.31 |
| 0.7854166666666668 | 65.31 |
| 0.7861111111111111 | 65.31 |
| 0.7868055555555555 | 65.31 |
| 0.7875 | 65.31 |
| 0.7881944444444445 | 65.31 |
| 0.7888888888888889 | 65.31 |
| 0.7895833333333333 | 65.31 |
| 0.7902777777777777 | 65.31 |
| 0.7909722222222223 | 65.31 |
| 0.7916666666666666 | 65.31 |
| 0.7923611111111111 | 65.31 |
| 0.7930555555555556 | 65.31 |
| 0.7937500000000001 | 65.31 |
| 0.7944444444444444 | 60.85 |
| 0.7951388888888888 | 60.85 |
| 0.7958333333333334 | 56.398 |
| 0.7965277777777778 | 56.398 |
| 0.7972222222222222 | 56.398 |
| 0.7979166666666666 | 51.951 |
| 0.7986111111111112 | 51.951 |
| 0.7993055555555556 | 51.951 |
| 0.7999999999999999 | 47.511 |
| 0.8006944444444444 | 47.511 |
| 0.8013888888888889 | 47.511 |
| 0.8020833333333334 | 47.511 |
| 0.8027777777777777 | 47.511 |
| 0.8034722222222223 | 47.511 |
| 0.8041666666666667 | 47.511 |
| 0.8048611111111111 | 47.511 |
| 0.8055555555555555 | 43.079 |
| 0.80625 | 43.079 |
| 0.8069444444444445 | 43.079 |
| 0.8076388888888889 | 38.653 |
| 0.8083333333333332 | 38.653 |
| 0.8090277777777778 | 38.653 |
| 0.8097222222222222 | 34.234 |
| 0.8104166666666667 | 34.234 |
| 0.811111111111111 | 34.234 |
| 0.8118055555555556 | 34.234 |
| 0.8125 | 29.823 |
| 0.8131944444444444 | 29.823 |
| 0.813888888888889 | 29.823 |
| 0.8145833333333333 | 25.419 |
| 0.8152777777777778 | 25.419 |
| 0.8159722222222222 | 25.419 |
| 0.8166666666666668 | 21.024 |
| 0.8173611111111111 | 21.024 |
| 0.8180555555555555 | 21.024 |
| 0.81875 | 21.024 |
| 0.8194444444444445 | 21.024 |
| 0.8201388888888889 | 21.024 |
| 0.8208333333333333 | 21.024 |
| 0.8215277777777777 | 16.636 |
| 0.8222222222222223 | 16.636 |
| 0.8229166666666666 | 16.636 |
| 0.8236111111111111 | 16.636 |
| 0.8243055555555556 | 12.257 |
| 0.8250000000000001 | 12.257 |
| 0.8256944444444444 | 12.257 |
| 0.8263888888888888 | 12.257 |
| 0.8270833333333334 | 12.257 |
| 0.8277777777777778 | 12.257 |
| 0.8284722222222222 | 12.257 |
| 0.8291666666666666 | 7.887 |
| 0.8298611111111112 | 7.887 |
| 0.8305555555555556 | 7.887 |
| 0.8312499999999999 | 7.887 |
| 0.8319444444444444 | 7.887 |
| 0.8326388888888889 | 7.887 |
| 0.8333333333333334 | 3.525 |
| 0.8340277777777777 | 3.525 |
| 0.8347222222222223 | 3.525 |
| 0.8354166666666667 | 3.525 |
| 0.8361111111111111 | 3.525 |
| 0.8368055555555555 | 3.525 |
| 0.8375 | 3.525 |
| 0.8381944444444445 | 3.525 |
| 0.8388888888888889 | 3.525 |
| 0.8395833333333332 | 0 |
| 0.8402777777777778 | 0 |
| 0.8409722222222222 | 0 |
| 0.8416666666666667 | 0 |
| 0.842361111111111 | 0 |
| 0.8430555555555556 | 0 |
| 0.84375 | 0 |
| 0.8444444444444444 | 0 |
| 0.845138888888889 | 0 |
| 0.8458333333333333 | 0 |
| 0.8465277777777778 | 0 |
| 0.8472222222222222 | 0 |
| 0.8479166666666668 | 0 |
| 0.8486111111111111 | 0 |
| 0.8493055555555555 | 0 |
| 0.85 | 0 |
| 0.8506944444444445 | 0 |
| 0.8513888888888889 | 0 |
| 0.8520833333333333 | 0 |
| 0.8527777777777777 | 0 |
| 0.8534722222222223 | 0 |
| 0.8541666666666666 | 0 |
| 0.8548611111111111 | 0 |
| 0.8555555555555556 | 0 |
| 0.8562500000000001 | 0 |
| 0.8569444444444444 | 0 |
| 0.8576388888888888 | 0 |
| 0.8583333333333334 | 0 |
| 0.8590277777777778 | 0 |
| 0.8597222222222222 | 0 |
| 0.8604166666666666 | 0 |
| 0.8611111111111112 | 0 |
| 0.8618055555555556 | 0 |
| 0.8624999999999999 | 0 |
| 0.8631944444444444 | 0 |
| 0.8638888888888889 | 0 |
| 0.8645833333333334 | 0 |
| 0.8652777777777777 | 0 |
| 0.8659722222222223 | 0 |
| 0.8666666666666667 | 0 |
| 0.8673611111111111 | 0 |
| 0.8680555555555555 | 0 |
| 0.86875 | 0 |
| 0.8694444444444445 | 0 |
| 0.8701388888888889 | 0 |
| 0.8708333333333332 | 0 |
| 0.8715277777777778 | 0 |
| 0.8722222222222222 | 0 |
| 0.8729166666666667 | 0 |
| 0.873611111111111 | 0 |
| 0.8743055555555556 | 0 |
| 0.875 | 0 |
| 0.8756944444444444 | 0 |
| 0.876388888888889 | 0 |
| 0.8770833333333333 | 0 |
| 0.8777777777777778 | 0 |
| 0.8784722222222222 | 0 |
| 0.8791666666666668 | 0 |
| 0.8798611111111111 | 0 |
| 0.8805555555555555 | 0 |
| 0.88125 | 0 |
| 0.8819444444444445 | 0 |
| 0.8826388888888889 | 0 |
| 0.8833333333333333 | 0 |
| 0.8840277777777777 | 0 |
| 0.8847222222222223 | 0 |
| 0.8854166666666666 | 0 |
| 0.8861111111111111 | 0 |
| 0.8868055555555556 | 0 |
| 0.8875000000000001 | 0 |
| 0.8881944444444444 | 0 |
| 0.8888888888888888 | 0 |
| 0.8895833333333334 | 0 |
| 0.8902777777777778 | 0 |
| 0.8909722222222222 | 0 |
| 0.8916666666666666 | 0 |
| 0.8923611111111112 | 0 |
| 0.8930555555555556 | 0 |
| 0.8937499999999999 | 0 |
| 0.8944444444444444 | 0 |
| 0.8951388888888889 | 0 |
| 0.8958333333333334 | 0 |
| 0.8965277777777777 | 0 |
| 0.8972222222222223 | 0 |
| 0.8979166666666667 | 0 |
| 0.8986111111111111 | 0 |
| 0.8993055555555555 | 0 |
| 0.9 | 0 |
| 0.9006944444444445 | 0 |
| 0.9013888888888889 | 0 |
| 0.9020833333333332 | 0 |
| 0.9027777777777778 | 0 |
| 0.9034722222222222 | 0 |
| 0.9041666666666667 | 0 |
| 0.904861111111111 | 0 |
| 0.9055555555555556 | 0 |
| 0.90625 | 0 |
| 0.9069444444444444 | 0 |
| 0.907638888888889 | 0 |
| 0.9083333333333333 | 0 |
| 0.9090277777777778 | 0 |
| 0.9097222222222222 | 0 |
| 0.9104166666666668 | 0 |
| 0.9111111111111111 | 0 |
| 0.9118055555555555 | 0 |
| 0.9125 | 0 |
| 0.9131944444444445 | 0 |
| 0.9138888888888889 | 0 |
| 0.9145833333333333 | 0 |
| 0.9152777777777777 | 0 |
| 0.9159722222222223 | 0 |
| 0.9166666666666666 | 0 |
| 0.9173611111111111 | 0 |
| 0.9180555555555556 | 0 |
| 0.9187500000000001 | 0 |
| 0.9194444444444444 | 0 |
| 0.9201388888888888 | 0 |
| 0.9208333333333334 | 0 |
| 0.9215277777777778 | 0 |
| 0.9222222222222222 | 0 |
| 0.9229166666666666 | 0 |
| 0.9236111111111112 | 0 |
| 0.9243055555555556 | 0 |
| 0.9249999999999999 | 0 |
| 0.9256944444444444 | 0 |
| 0.9263888888888889 | 0 |
| 0.9270833333333334 | 0 |
| 0.9277777777777777 | 0 |
| 0.9284722222222223 | 0 |
| 0.9291666666666667 | 0 |
| 0.9298611111111111 | 0 |
| 0.9305555555555555 | 0 |
| 0.93125 | 0 |
| 0.9319444444444445 | 0 |
| 0.9326388888888889 | 0 |
| 0.9333333333333332 | 0 |
| 0.9340277777777778 | 0 |
| 0.9347222222222222 | 0 |
| 0.9354166666666667 | 0 |
| 0.936111111111111 | 0 |
| 0.9368055555555556 | 0 |
| 0.9375 | 0 |
| 0.9381944444444444 | 0 |
| 0.938888888888889 | 0 |
| 0.9395833333333333 | 0 |
| 0.9402777777777778 | 0 |
| 0.9409722222222222 | 0 |
| 0.9416666666666668 | 0 |
| 0.9423611111111111 | 0 |
| 0.9430555555555555 | 0 |
| 0.94375 | 0 |
| 0.9444444444444445 | 0 |
| 0.9451388888888889 | 0 |
| 0.9458333333333333 | 0 |
| 0.9465277777777777 | 0 |
| 0.9472222222222223 | 0 |
| 0.9479166666666666 | 0 |
| 0.9486111111111111 | 0 |
| 0.9493055555555556 | 0 |
| 0.9500000000000001 | 0 |
| 0.9506944444444444 | 0 |
| 0.9513888888888888 | 0 |
| 0.9520833333333334 | 0 |
| 0.9527777777777778 | 0 |
| 0.9534722222222222 | 0 |
| 0.9541666666666666 | 0 |
| 0.9548611111111112 | 0 |
| 0.9555555555555556 | 0 |
| 0.9562499999999999 | 0 |
| 0.9569444444444444 | 0 |
| 0.9576388888888889 | 0 |
| 0.9583333333333334 | 0 |
| 0.9590277777777777 | 0 |
| 0.9597222222222223 | 0 |
| 0.9604166666666667 | 0 |
| 0.9611111111111111 | 0 |
| 0.9618055555555555 | 0 |
| 0.9625 | 0 |
| 0.9631944444444445 | 0 |
| 0.9638888888888889 | 0 |
| 0.9645833333333332 | 0 |
| 0.9652777777777778 | 0 |
| 0.9659722222222222 | 0 |
| 0.9666666666666667 | 0 |
| 0.967361111111111 | 0 |
| 0.9680555555555556 | 0 |
| 0.96875 | 0 |
| 0.9694444444444444 | 0 |
| 0.970138888888889 | 0 |
| 0.9708333333333333 | 0 |
| 0.9715277777777778 | 0 |
| 0.9722222222222222 | 0 |
| 0.9729166666666668 | 0 |
| 0.9736111111111111 | 0 |
| 0.9743055555555555 | 0 |
| 0.975 | 0 |
| 0.9756944444444445 | 0 |
| 0.9763888888888889 | 0 |
| 0.9770833333333333 | 0 |
| 0.9777777777777777 | 0 |
| 0.9784722222222223 | 0 |
| 0.9791666666666666 | 0 |
| 0.9798611111111111 | 0 |
| 0.9805555555555556 | 0 |
| 0.9812500000000001 | 0 |
| 0.9819444444444444 | 0 |
| 0.9826388888888888 | 0 |
| 0.9833333333333334 | 0 |
| 0.9840277777777778 | 0 |
| 0.9847222222222222 | 0 |
| 0.9854166666666666 | 0 |
| 0.9861111111111112 | 0 |
| 0.9868055555555556 | 0 |
| 0.9874999999999999 | 0 |
| 0.9881944444444444 | 0 |
| 0.9888888888888889 | 0 |
| 0.9895833333333334 | 0 |
| 0.9902777777777777 | 0 |
| 0.9909722222222223 | 0 |
| 0.9916666666666667 | 0 |
| 0.9923611111111111 | 0 |
| 0.9930555555555555 | 0 |
| 0.99375 | 0 |
| 0.9944444444444445 | 0 |
| 0.9951388888888889 | 0 |
| 0.9958333333333332 | 0 |
| 0.9965277777777778 | 0 |
| 0.9972222222222222 | 0 |
| 0.9979166666666667 | 0 |
| 0.998611111111111 | 0 |
| 0.9993055555555556 | 0 |